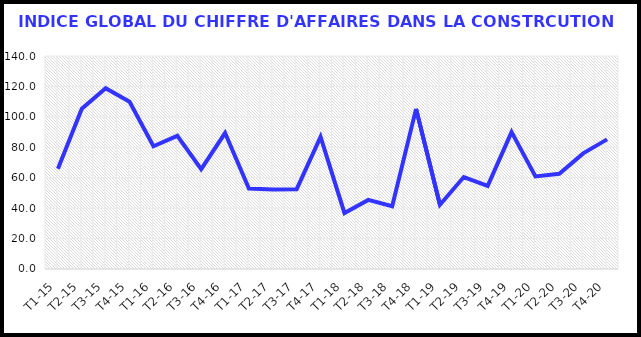
| Category | Series 0 |
|---|---|
| T1-15 | 65.925 |
| T2-15 | 105.287 |
| T3-15 | 118.824 |
| T4-15 | 109.963 |
| T1-16 | 80.681 |
| T2-16 | 87.519 |
| T3-16 | 65.646 |
| T4-16 | 89.361 |
| T1-17 | 52.926 |
| T2-17 | 52.227 |
| T3-17 | 52.485 |
| T4-17 | 86.835 |
| T1-18 | 36.837 |
| T2-18 | 45.418 |
| T3-18 | 41.23 |
| T4-18 | 105.253 |
| T1-19 | 42.265 |
| T2-19 | 60.447 |
| T3-19 | 54.63 |
| T4-19 | 89.956 |
| T1-20 | 60.863 |
| T2-20 | 62.616 |
| T3-20 | 76.006 |
| T4-20 | 85.207 |